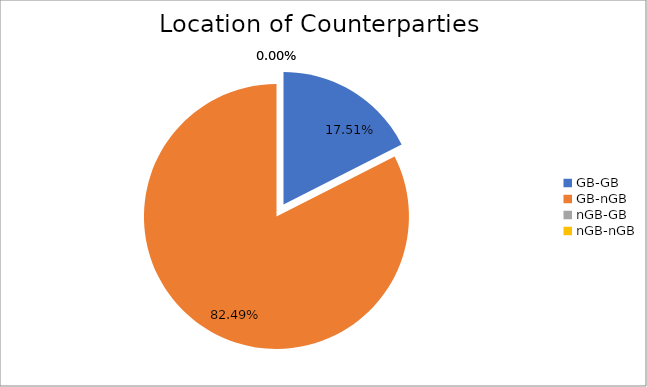
| Category | Series 0 |
|---|---|
| GB-GB | 1765576.389 |
| GB-nGB | 8316742.283 |
| nGB-GB | 0 |
| nGB-nGB | 50.416 |